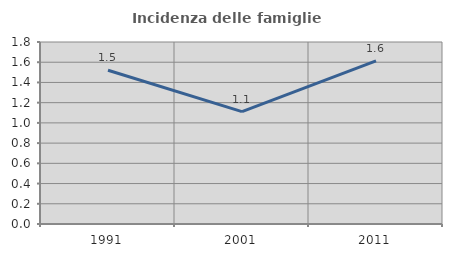
| Category | Incidenza delle famiglie numerose |
|---|---|
| 1991.0 | 1.521 |
| 2001.0 | 1.111 |
| 2011.0 | 1.613 |